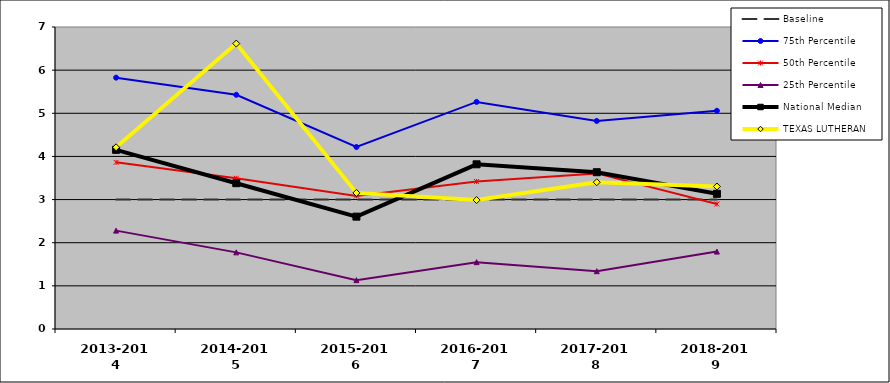
| Category | Baseline | 75th Percentile | 50th Percentile | 25th Percentile | National Median | TEXAS LUTHERAN |
|---|---|---|---|---|---|---|
| 2013-2014 | 3 | 5.826 | 3.863 | 2.28 | 4.153 | 4.212 |
| 2014-2015 | 3 | 5.429 | 3.492 | 1.776 | 3.379 | 6.615 |
| 2015-2016 | 3 | 4.218 | 3.084 | 1.133 | 2.604 | 3.155 |
| 2016-2017 | 3 | 5.264 | 3.418 | 1.549 | 3.818 | 2.989 |
| 2017-2018 | 3 | 4.822 | 3.606 | 1.34 | 3.634 | 3.403 |
| 2018-2019 | 3 | 5.057 | 2.898 | 1.794 | 3.133 | 3.303 |